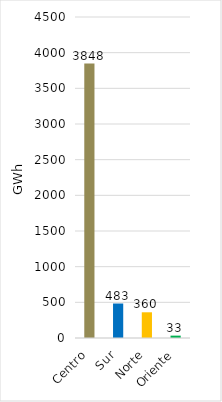
| Category | Series 0 |
|---|---|
| Centro | 3847.562 |
| Sur | 483.462 |
| Norte | 360.389 |
| Oriente | 33.251 |